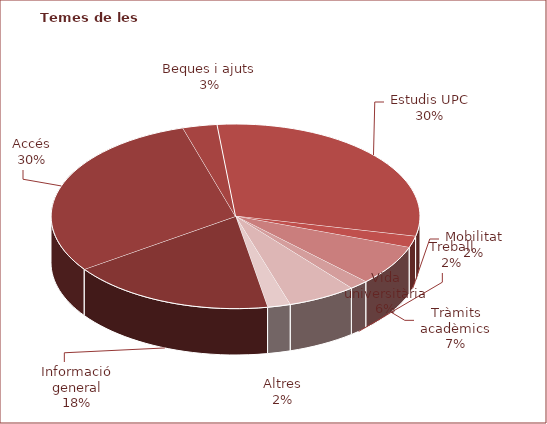
| Category | Series 0 |
|---|---|
| Informació general | 0.18 |
| Accés | 0.3 |
| Beques i ajuts | 0.03 |
| Estudis UPC | 0.3 |
| Mobilitat | 0.02 |
| Tràmits acadèmics | 0.07 |
| Treball | 0.017 |
| Vida universitària | 0.06 |
| Altres | 0.02 |